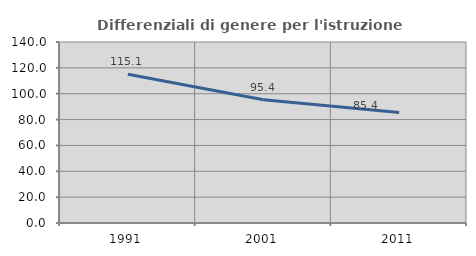
| Category | Differenziali di genere per l'istruzione superiore |
|---|---|
| 1991.0 | 115.116 |
| 2001.0 | 95.357 |
| 2011.0 | 85.423 |